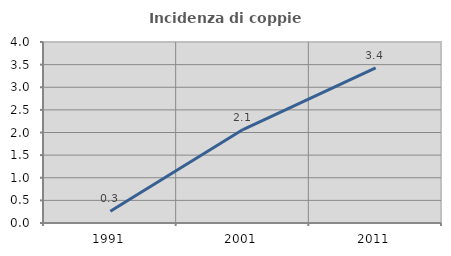
| Category | Incidenza di coppie miste |
|---|---|
| 1991.0 | 0.258 |
| 2001.0 | 2.064 |
| 2011.0 | 3.429 |